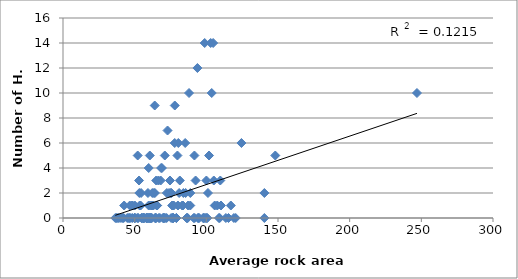
| Category | Average Rock |
|---|---|
| 92.51606666666665 | 3 |
| 70.99943846153847 | 5 |
| 61.150949999999995 | 0 |
| 59.29588 | 2 |
| 98.85512727272727 | 14 |
| 87.91576249999999 | 10 |
| 77.97586428571427 | 9 |
| 79.06706363636363 | 0 |
| 101.8923 | 5 |
| 52.12253333333334 | 5 |
| 49.887233333333334 | 0 |
| 68.13601875000002 | 3 |
| 48.26414166666666 | 1 |
| 59.801471428571425 | 4 |
| 64.00637222222221 | 9 |
| 73.96829090909091 | 2 |
| 75.68862222222222 | 2 |
| 77.96447272727272 | 6 |
| 59.80047272727273 | 1 |
| 75.097575 | 2 |
| 72.92575833333335 | 7 |
| 45.98736923076923 | 0 |
| 38.251571428571424 | 0 |
| 40.45459 | 0 |
| 58.9403076923077 | 0 |
| 58.49800714285715 | 0 |
| 49.925776923076924 | 0 |
| 50.0722357142857 | 1 |
| 42.31949999999999 | 0 |
| 75.48016 | 0 |
| 55.254775000000016 | 0 |
| 41.662594444444444 | 0 |
| 58.368090909090895 | 0 |
| 61.99381666666667 | 0 |
| 110.2268 | 1 |
| 59.85416428571428 | 0 |
| 69.7221090909091 | 0 |
| 61.58444999999999 | 0 |
| 53.04868421052631 | 3 |
| 77.20376875 | 1 |
| 62.106366666666666 | 1 |
| 71.09734285714286 | 0 |
| 63.03442 | 1 |
| 60.55352666666667 | 5 |
| 93.78331428571428 | 12 |
| 101.15343 | 2 |
| 91.69603076923077 | 5 |
| 79.84033333333333 | 5 |
| 74.63948749999999 | 3 |
| 105.85956999999999 | 1 |
| 76.8996111111111 | 1 |
| 62.293828571428584 | 2 |
| 80.45075 | 6 |
| 72.45356666666666 | 2 |
| 46.59010000000001 | 1 |
| 68.45125000000002 | 4 |
| 63.413564705882344 | 2 |
| 81.03378571428573 | 2 |
| 65.03847142857143 | 3 |
| 66.5265625 | 3 |
| 54.48371764705883 | 2 |
| 65.61258888888888 | 1 |
| 117.0882125 | 1 |
| 81.49065454545453 | 3 |
| 80.17967142857141 | 1 |
| 77.01065000000001 | 0 |
| 65.66280769230772 | 1 |
| 53.482952 | 1 |
| 56.12742222222223 | 0 |
| 60.69415714285714 | 0 |
| 48.470231818181816 | 1 |
| 85.26200000000001 | 6 |
| 67.56689999999999 | 0 |
| 57.1178 | 0 |
| 64.50877142857141 | 0 |
| 91.2051 | 0 |
| 71.02488 | 0 |
| 107.62528999999999 | 1 |
| 65.38595333333335 | 1 |
| 88.79625714285714 | 1 |
| 52.439166666666665 | 0 |
| 64.118575 | 2 |
| 56.51311666666667 | 0 |
| 50.75091666666667 | 0 |
| 54.71895714285714 | 0 |
| 70.1265 | 0 |
| 54.13864000000001 | 1 |
| 37.29218181818181 | 0 |
| 42.67245555555556 | 1 |
| 54.9469875 | 0 |
| 39.0276625 | 0 |
| 52.15345263157896 | 0 |
| 94.21805833333333 | 0 |
| 87.00483333333332 | 0 |
| 115.45673 | 0 |
| 99.79031666666667 | 0 |
| 246.97199999999998 | 10 |
| 60.415633333333325 | 0 |
| 95.01264 | 0 |
| 55.89071666666667 | 0 |
| 56.19906666666666 | 0 |
| 140.489 | 0 |
| 36.509949999999996 | 0 |
| 46.23869 | 0 |
| 103.05491428571426 | 14 |
| 61.22802222222222 | 0 |
| 148.09438000000003 | 5 |
| 64.25695000000002 | 0 |
| 124.50039999999998 | 6 |
| 98.07402142857144 | 0 |
| 59.78353333333333 | 0 |
| 108.78137142857143 | 0 |
| 113.61247142857142 | 0 |
| 61.023522222222226 | 1 |
| 86.18656666666668 | 0 |
| 44.83285 | 0 |
| 120.51063750000002 | 0 |
| 103.77903333333335 | 10 |
| 109.73287499999999 | 3 |
| 88.82685000000001 | 2 |
| 83.17207142857144 | 1 |
| 72.31092000000001 | 0 |
| 58.492825 | 0 |
| 83.67769000000001 | 1 |
| 119.2426 | 0 |
| 87.30376666666666 | 1 |
| 53.245830769230764 | 2 |
| 64.74466249999999 | 0 |
| 85.55944285714284 | 2 |
| 83.98040624999999 | 2 |
| 79.13199374999999 | 0 |
| 100.68922222222221 | 0 |
| 76.58890999999998 | 0 |
| 64.3953294117647 | 0 |
| 69.04352941176471 | 4 |
| 76.74340000000001 | 0 |
| 100.05321666666667 | 3 |
| 105.19517499999999 | 3 |
| 104.7699 | 14 |
| 98.61186666666667 | 0 |
| 64.91038888888889 | 0 |
| 66.88941666666666 | 0 |
| 94.31557142857142 | 0 |
| 99.7877 | 0 |
| 109.35494999999999 | 0 |
| 140.4949 | 2 |
| 58.37698888888888 | 0 |
| 76.1190142857143 | 1 |
| 97.72500000000001 | 0 |
| 47.33722857142857 | 0 |
| 70.24114 | 0 |
| 86.62236 | 0 |
| 76.79198333333332 | 0 |
| 91.90084999999999 | 0 |
| 48.585266666666676 | 0 |